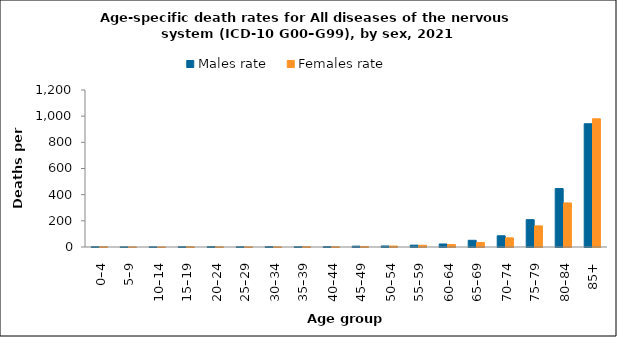
| Category | Males rate | Females rate |
|---|---|---|
| 0–4 | 2.19 | 2.317 |
| 5–9 | 1.082 | 0.509 |
| 10–14 | 1.077 | 0.507 |
| 15–19 | 1.837 | 2.09 |
| 20–24 | 2.748 | 1.145 |
| 25–29 | 1.851 | 0.996 |
| 30–34 | 2.764 | 1.043 |
| 35–39 | 2.047 | 2.768 |
| 40–44 | 2.942 | 2.027 |
| 45–49 | 6.485 | 4.203 |
| 50–54 | 7.807 | 7.463 |
| 55–59 | 14.032 | 13.452 |
| 60–64 | 23.06 | 18.572 |
| 65–69 | 51.171 | 33.806 |
| 70–74 | 85.813 | 70.092 |
| 75–79 | 208.848 | 161.439 |
| 80–84 | 446.868 | 336.779 |
| 85+ | 941.973 | 979.895 |